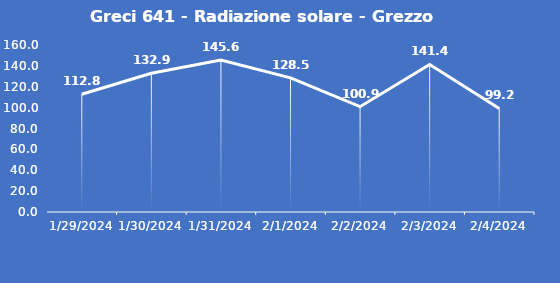
| Category | Greci 641 - Radiazione solare - Grezzo (W/m2) |
|---|---|
| 1/29/24 | 112.8 |
| 1/30/24 | 132.9 |
| 1/31/24 | 145.6 |
| 2/1/24 | 128.5 |
| 2/2/24 | 100.9 |
| 2/3/24 | 141.4 |
| 2/4/24 | 99.2 |